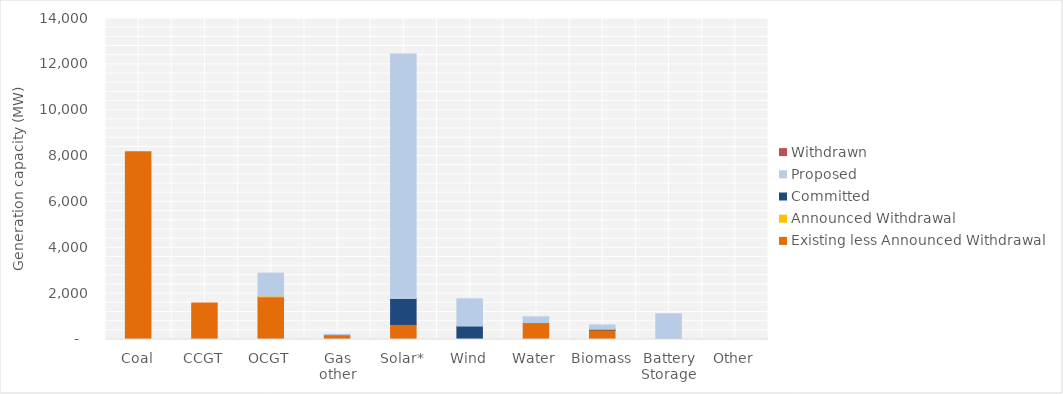
| Category | Existing less Announced Withdrawal | Announced Withdrawal | Committed | Proposed | Withdrawn |
|---|---|---|---|---|---|
| Coal | 8186 | 0 | 0 | 0 | 0 |
| CCGT | 1595.5 | 0 | 0 | 0 | 0 |
| OCGT | 1860.5 | 34 | 0 | 1000 | 0 |
| Gas other | 208.37 | 0 | 0 | 15.205 | 0 |
| Solar* | 658.926 | 0 | 1128 | 10670.227 | 0 |
| Wind | 12 | 0 | 573.7 | 1188.4 | 0 |
| Water | 738.2 | 0 | 0 | 250 | 0 |
| Biomass | 419.19 | 0 | 24 | 189.6 | 0 |
| Battery Storage | 0 | 0 | 2 | 1120 | 0 |
| Other | 1 | 0 | 0 | 0 | 0 |